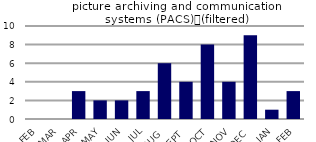
| Category | picture archiving and communication systems (PACS)　(filtered) |
|---|---|
| FEB | 0 |
| MAR | 0 |
| APR | 3 |
| MAY | 2 |
| JUN | 2 |
| JUL | 3 |
| AUG | 6 |
| SEPT | 4 |
| OCT | 8 |
| NOV | 4 |
| DEC | 9 |
| JAN | 1 |
| FEB | 3 |